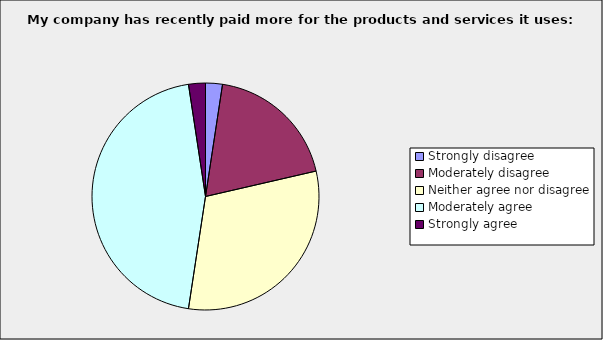
| Category | Series 0 |
|---|---|
| Strongly disagree | 0.024 |
| Moderately disagree | 0.19 |
| Neither agree nor disagree | 0.31 |
| Moderately agree | 0.452 |
| Strongly agree | 0.024 |